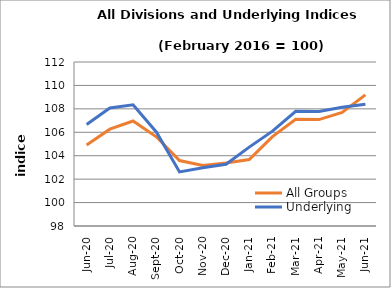
| Category | All Groups | Underlying |
|---|---|---|
| 2020-06-01 | 104.913 | 106.661 |
| 2020-07-01 | 106.265 | 108.077 |
| 2020-08-01 | 106.963 | 108.349 |
| 2020-09-01 | 105.614 | 106.027 |
| 2020-10-01 | 103.588 | 102.619 |
| 2020-11-01 | 103.171 | 102.969 |
| 2020-12-01 | 103.378 | 103.266 |
| 2021-01-01 | 103.671 | 104.733 |
| 2021-02-01 | 105.627 | 106.099 |
| 2021-03-01 | 107.11 | 107.788 |
| 2021-04-01 | 107.082 | 107.772 |
| 2021-05-01 | 107.693 | 108.128 |
| 2021-06-01 | 109.193 | 108.399 |